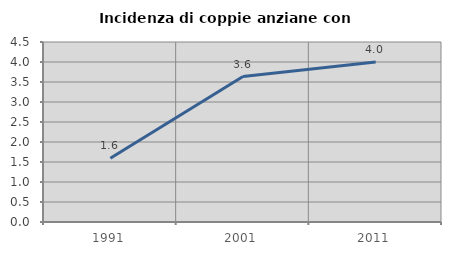
| Category | Incidenza di coppie anziane con figli |
|---|---|
| 1991.0 | 1.595 |
| 2001.0 | 3.636 |
| 2011.0 | 4 |